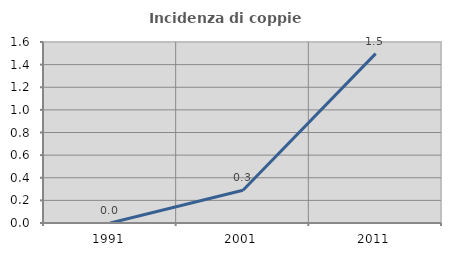
| Category | Incidenza di coppie miste |
|---|---|
| 1991.0 | 0 |
| 2001.0 | 0.29 |
| 2011.0 | 1.497 |